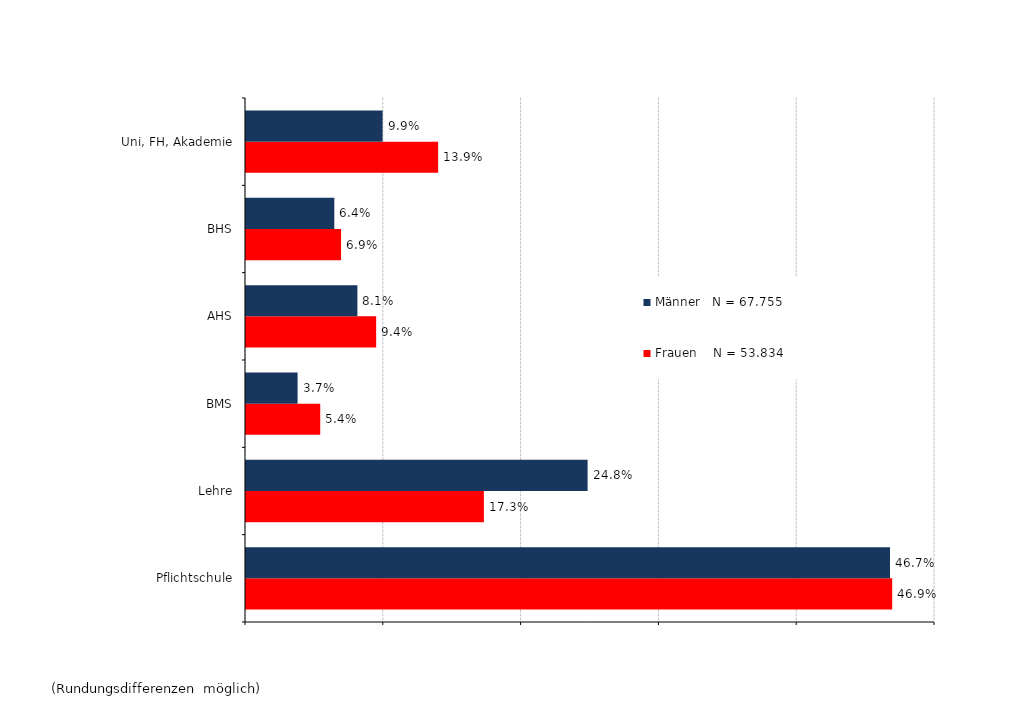
| Category | Frauen    N = 53.834 | Männer   N = 67.755 |
|---|---|---|
| Pflichtschule | 0.469 | 0.467 |
| Lehre | 0.173 | 0.248 |
| BMS | 0.054 | 0.037 |
| AHS | 0.094 | 0.081 |
| BHS | 0.069 | 0.064 |
| Uni, FH, Akademie | 0.139 | 0.099 |